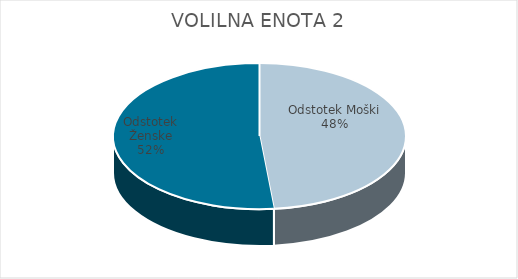
| Category | VOLILNA ENOTA 2 | #REF! | Slovenija skupaj |
|---|---|---|---|
| Odstotek Moški | 32.93 |  | 33.67 |
| Odstotek Ženske | 35.06 |  | 35.97 |